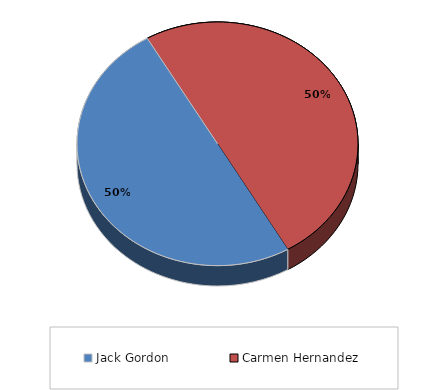
| Category | Series 0 |
|---|---|
| Jack Gordon | 0.5 |
| Carmen Hernandez | 0.5 |